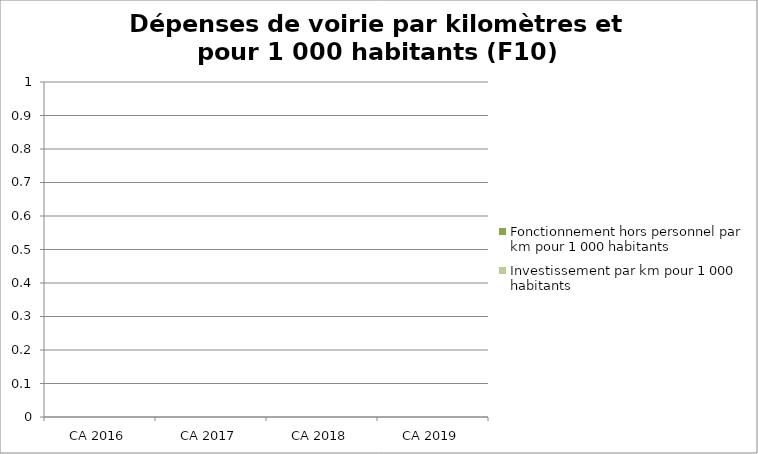
| Category | Fonctionnement hors personnel par km pour 1 000 habitants | Investissement par km pour 1 000 habitants |
|---|---|---|
| CA 2016 | 0 | 0 |
| CA 2017 | 0 | 0 |
| CA 2018 | 0 | 0 |
| CA 2019 | 0 | 0 |